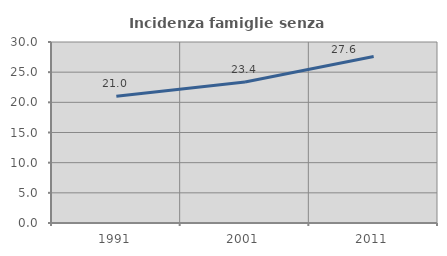
| Category | Incidenza famiglie senza nuclei |
|---|---|
| 1991.0 | 21.015 |
| 2001.0 | 23.371 |
| 2011.0 | 27.589 |